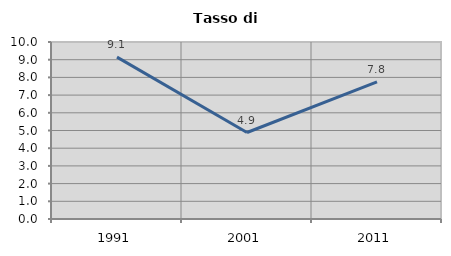
| Category | Tasso di disoccupazione   |
|---|---|
| 1991.0 | 9.144 |
| 2001.0 | 4.886 |
| 2011.0 | 7.752 |